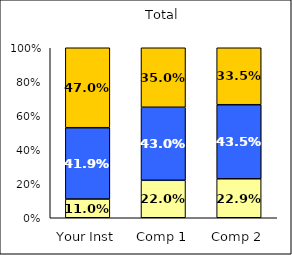
| Category | Low Civic Awareness | Average Civic Awareness | High Civic Awareness |
|---|---|---|---|
| Your Inst | 0.11 | 0.419 | 0.47 |
| Comp 1 | 0.22 | 0.43 | 0.35 |
| Comp 2 | 0.229 | 0.435 | 0.335 |